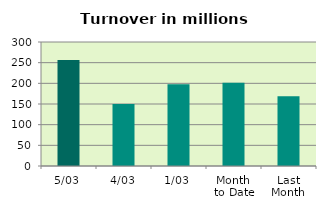
| Category | Series 0 |
|---|---|
| 5/03 | 256.535 |
| 4/03 | 150.009 |
| 1/03 | 197.938 |
| Month 
to Date | 201.494 |
| Last
Month | 168.971 |